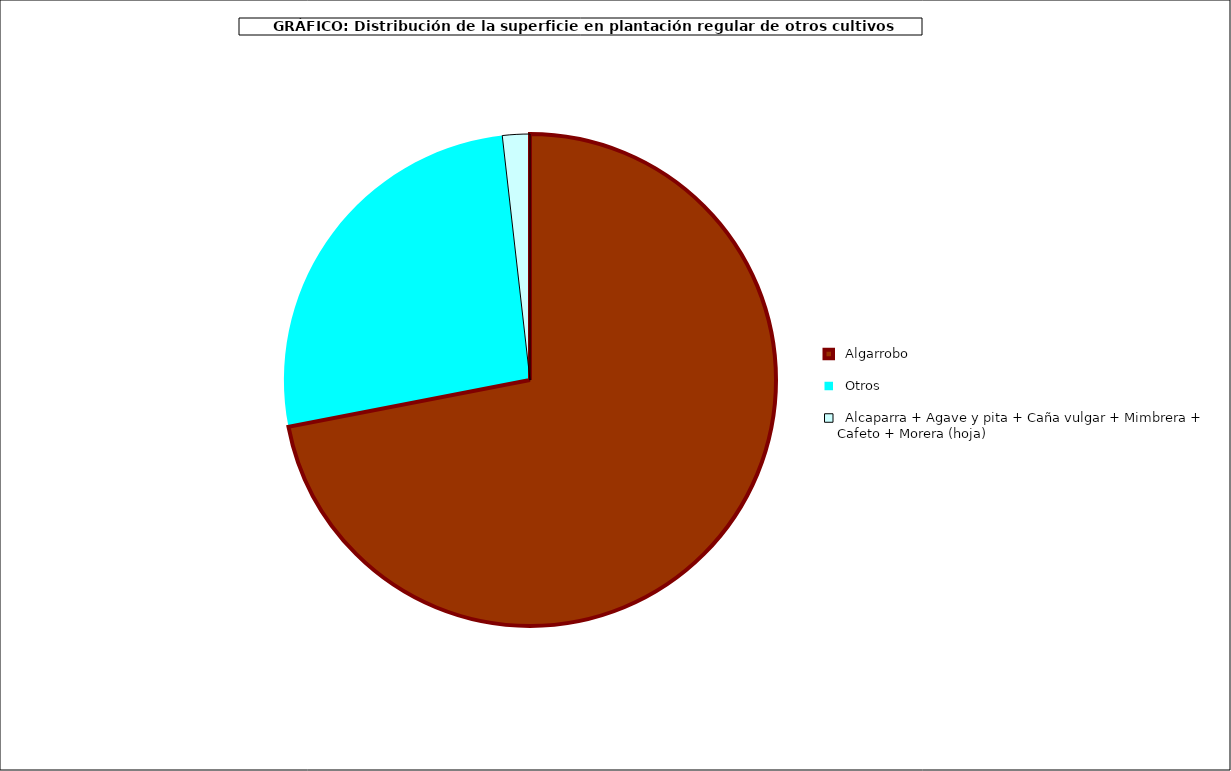
| Category | Series 0 |
|---|---|
|   Algarrobo | 39626 |
|   Otros | 14455 |
|   Alcaparra + Agave y pita + Caña vulgar + Mimbrera + Cafeto + Morera (hoja) | 991 |